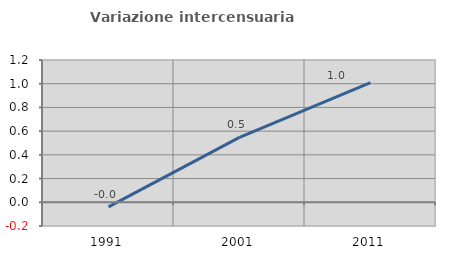
| Category | Variazione intercensuaria annua |
|---|---|
| 1991.0 | -0.039 |
| 2001.0 | 0.547 |
| 2011.0 | 1.009 |